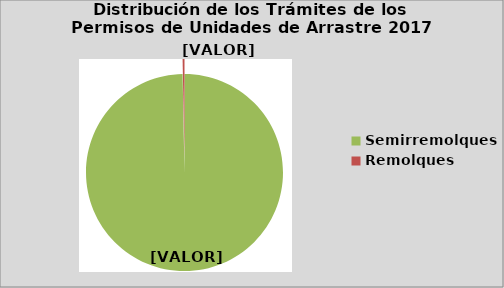
| Category | Series 0 |
|---|---|
| Semirremolques | 99.69 |
| Remolques | 0.31 |